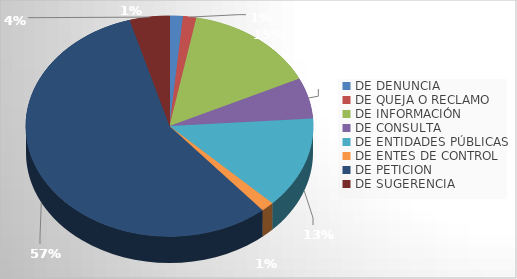
| Category | Series 0 |
|---|---|
| DE DENUNCIA | 1 |
| DE QUEJA O RECLAMO | 1 |
| DE INFORMACIÓN | 10 |
| DE CONSULTA | 4 |
| DE ENTIDADES PÚBLICAS | 9 |
| DE ENTES DE CONTROL | 1 |
| DE PETICION | 38 |
| DE SUGERENCIA | 3 |